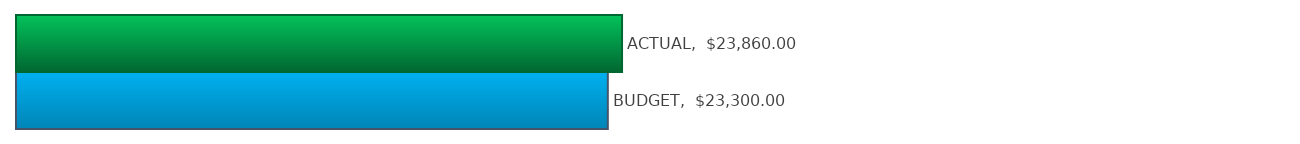
| Category | Series 0 |
|---|---|
| BUDGET | 23300 |
| ACTUAL | 23860 |